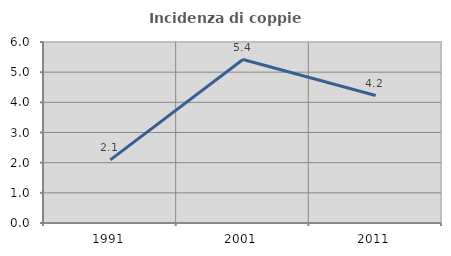
| Category | Incidenza di coppie miste |
|---|---|
| 1991.0 | 2.094 |
| 2001.0 | 5.419 |
| 2011.0 | 4.225 |